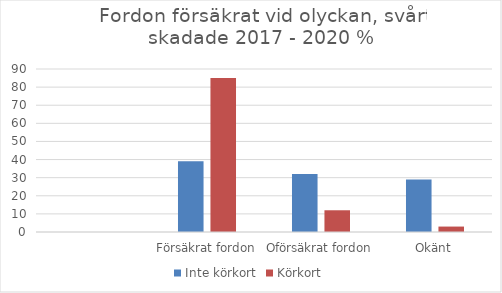
| Category | Inte körkort | Körkort |
|---|---|---|
|  | 0 | 0 |
| Försäkrat fordon | 39 | 85 |
| Oförsäkrat fordon | 32 | 12 |
| Okänt | 29 | 3 |